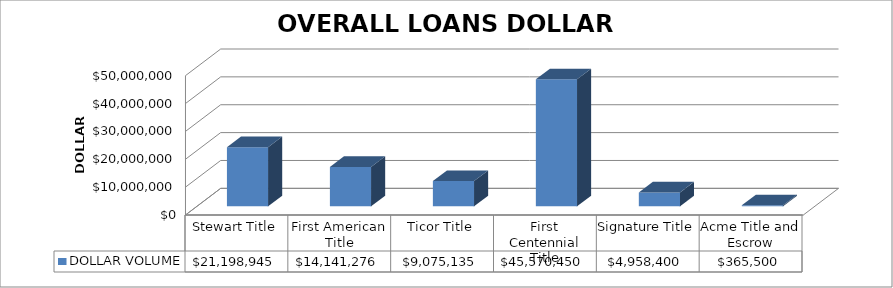
| Category | DOLLAR VOLUME |
|---|---|
| Stewart Title | 21198945 |
| First American Title | 14141275.52 |
| Ticor Title | 9075135 |
| First Centennial Title | 45570450 |
| Signature Title | 4958400 |
| Acme Title and Escrow | 365500 |